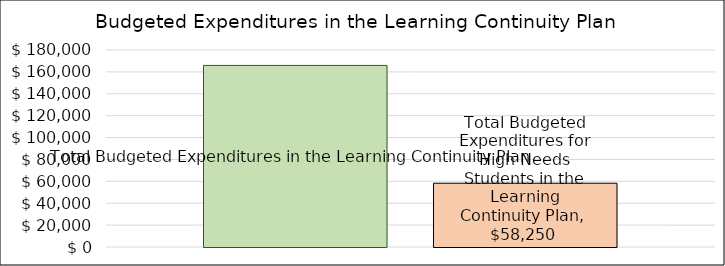
| Category | Total Budgeted Expenditures in the Learning Continuity Plan | Total Budgeted Expenditures for High Needs Students in the Learning Continuity Plan |
|---|---|---|
| 0 | 165898 | 58250 |